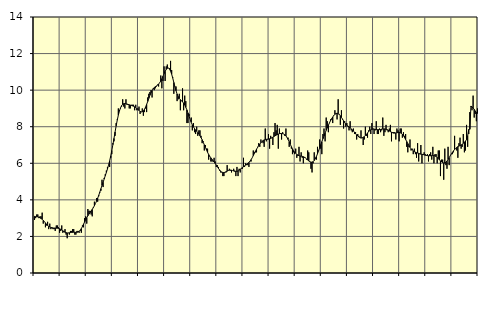
| Category | Piggar | Series 1 |
|---|---|---|
| nan | 2.9 | 3.1 |
| 87.0 | 3 | 3.08 |
| 87.0 | 3.2 | 3.08 |
| 87.0 | 3.2 | 3.07 |
| 87.0 | 3 | 3.05 |
| 87.0 | 3.1 | 3.02 |
| 87.0 | 3.1 | 2.98 |
| 87.0 | 3.3 | 2.94 |
| 87.0 | 2.7 | 2.88 |
| 87.0 | 2.8 | 2.81 |
| 87.0 | 2.5 | 2.74 |
| 87.0 | 2.6 | 2.67 |
| nan | 2.8 | 2.6 |
| 88.0 | 2.4 | 2.55 |
| 88.0 | 2.7 | 2.52 |
| 88.0 | 2.4 | 2.49 |
| 88.0 | 2.5 | 2.47 |
| 88.0 | 2.4 | 2.46 |
| 88.0 | 2.4 | 2.46 |
| 88.0 | 2.3 | 2.46 |
| 88.0 | 2.6 | 2.45 |
| 88.0 | 2.6 | 2.45 |
| 88.0 | 2.5 | 2.44 |
| 88.0 | 2.2 | 2.42 |
| nan | 2.3 | 2.39 |
| 89.0 | 2.6 | 2.35 |
| 89.0 | 2.2 | 2.31 |
| 89.0 | 2.3 | 2.26 |
| 89.0 | 2.4 | 2.23 |
| 89.0 | 2.1 | 2.21 |
| 89.0 | 1.9 | 2.19 |
| 89.0 | 2.2 | 2.19 |
| 89.0 | 2.1 | 2.2 |
| 89.0 | 2.3 | 2.21 |
| 89.0 | 2.3 | 2.22 |
| 89.0 | 2.4 | 2.22 |
| nan | 2.4 | 2.23 |
| 90.0 | 2.1 | 2.23 |
| 90.0 | 2.1 | 2.22 |
| 90.0 | 2.3 | 2.23 |
| 90.0 | 2.3 | 2.24 |
| 90.0 | 2.2 | 2.28 |
| 90.0 | 2.3 | 2.34 |
| 90.0 | 2.2 | 2.43 |
| 90.0 | 2.6 | 2.54 |
| 90.0 | 2.5 | 2.67 |
| 90.0 | 3 | 2.79 |
| 90.0 | 3.1 | 2.91 |
| nan | 2.7 | 3.03 |
| 91.0 | 3.5 | 3.13 |
| 91.0 | 3.4 | 3.22 |
| 91.0 | 3.4 | 3.31 |
| 91.0 | 3.2 | 3.39 |
| 91.0 | 3.1 | 3.48 |
| 91.0 | 3.6 | 3.57 |
| 91.0 | 3.9 | 3.68 |
| 91.0 | 3.8 | 3.8 |
| 91.0 | 4.1 | 3.94 |
| 91.0 | 3.9 | 4.09 |
| 91.0 | 4.2 | 4.25 |
| nan | 4.4 | 4.43 |
| 92.0 | 4.5 | 4.61 |
| 92.0 | 5.1 | 4.79 |
| 92.0 | 4.7 | 4.96 |
| 92.0 | 5.2 | 5.14 |
| 92.0 | 5.4 | 5.32 |
| 92.0 | 5.6 | 5.5 |
| 92.0 | 5.8 | 5.69 |
| 92.0 | 5.9 | 5.9 |
| 92.0 | 5.8 | 6.13 |
| 92.0 | 6.3 | 6.4 |
| 92.0 | 6.5 | 6.7 |
| nan | 7.1 | 7.02 |
| 93.0 | 7.2 | 7.36 |
| 93.0 | 7.5 | 7.71 |
| 93.0 | 8.2 | 8.05 |
| 93.0 | 8.4 | 8.36 |
| 93.0 | 9 | 8.63 |
| 93.0 | 8.9 | 8.86 |
| 93.0 | 9 | 9.03 |
| 93.0 | 9.1 | 9.15 |
| 93.0 | 9.5 | 9.23 |
| 93.0 | 9.1 | 9.26 |
| 93.0 | 9 | 9.27 |
| nan | 9.5 | 9.26 |
| 94.0 | 9.2 | 9.24 |
| 94.0 | 9.2 | 9.22 |
| 94.0 | 9 | 9.2 |
| 94.0 | 9 | 9.18 |
| 94.0 | 9.2 | 9.16 |
| 94.0 | 9.2 | 9.14 |
| 94.0 | 9.2 | 9.12 |
| 94.0 | 8.9 | 9.09 |
| 94.0 | 9.2 | 9.05 |
| 94.0 | 8.9 | 9 |
| 94.0 | 9 | 8.94 |
| nan | 9.1 | 8.89 |
| 95.0 | 8.7 | 8.84 |
| 95.0 | 8.8 | 8.81 |
| 95.0 | 9 | 8.82 |
| 95.0 | 8.6 | 8.86 |
| 95.0 | 8.8 | 8.95 |
| 95.0 | 9 | 9.07 |
| 95.0 | 8.8 | 9.22 |
| 95.0 | 9.6 | 9.38 |
| 95.0 | 9.8 | 9.55 |
| 95.0 | 9.9 | 9.72 |
| 95.0 | 10 | 9.86 |
| nan | 9.6 | 9.98 |
| 96.0 | 10.1 | 10.07 |
| 96.0 | 10 | 10.14 |
| 96.0 | 10.1 | 10.19 |
| 96.0 | 10.2 | 10.23 |
| 96.0 | 10.3 | 10.27 |
| 96.0 | 10.2 | 10.33 |
| 96.0 | 10.4 | 10.41 |
| 96.0 | 10.8 | 10.5 |
| 96.0 | 10.1 | 10.62 |
| 96.0 | 10.5 | 10.76 |
| 96.0 | 11.3 | 10.9 |
| nan | 10.5 | 11.03 |
| 97.0 | 11.3 | 11.13 |
| 97.0 | 11.4 | 11.2 |
| 97.0 | 11.2 | 11.21 |
| 97.0 | 11.2 | 11.16 |
| 97.0 | 11.6 | 11.04 |
| 97.0 | 11.1 | 10.87 |
| 97.0 | 10.7 | 10.66 |
| 97.0 | 9.8 | 10.42 |
| 97.0 | 10.2 | 10.18 |
| 97.0 | 10.2 | 9.97 |
| 97.0 | 9.4 | 9.79 |
| nan | 9.5 | 9.65 |
| 98.0 | 9.8 | 9.55 |
| 98.0 | 8.9 | 9.48 |
| 98.0 | 9.4 | 9.42 |
| 98.0 | 10.1 | 9.36 |
| 98.0 | 8.9 | 9.29 |
| 98.0 | 9.7 | 9.19 |
| 98.0 | 9.4 | 9.06 |
| 98.0 | 8.2 | 8.92 |
| 98.0 | 8.2 | 8.75 |
| 98.0 | 8.7 | 8.57 |
| 98.0 | 8.4 | 8.4 |
| nan | 8.5 | 8.24 |
| 99.0 | 7.8 | 8.1 |
| 99.0 | 8.2 | 7.99 |
| 99.0 | 7.7 | 7.9 |
| 99.0 | 7.6 | 7.82 |
| 99.0 | 8 | 7.75 |
| 99.0 | 7.5 | 7.68 |
| 99.0 | 7.8 | 7.6 |
| 99.0 | 7.8 | 7.5 |
| 99.0 | 7.5 | 7.4 |
| 99.0 | 7.1 | 7.29 |
| 99.0 | 7.2 | 7.15 |
| nan | 6.7 | 7.01 |
| 0.0 | 7 | 6.87 |
| 0.0 | 6.8 | 6.73 |
| 0.0 | 6.8 | 6.6 |
| 0.0 | 6.2 | 6.48 |
| 0.0 | 6.4 | 6.38 |
| 0.0 | 6.1 | 6.3 |
| 0.0 | 6.1 | 6.22 |
| 0.0 | 6.1 | 6.14 |
| 0.0 | 6.3 | 6.07 |
| 0.0 | 6.1 | 5.99 |
| 0.0 | 5.8 | 5.9 |
| nan | 5.9 | 5.81 |
| 1.0 | 5.8 | 5.72 |
| 1.0 | 5.6 | 5.64 |
| 1.0 | 5.5 | 5.57 |
| 1.0 | 5.5 | 5.52 |
| 1.0 | 5.3 | 5.5 |
| 1.0 | 5.3 | 5.49 |
| 1.0 | 5.5 | 5.51 |
| 1.0 | 5.5 | 5.54 |
| 1.0 | 5.9 | 5.57 |
| 1.0 | 5.6 | 5.6 |
| 1.0 | 5.7 | 5.62 |
| nan | 5.6 | 5.63 |
| 2.0 | 5.5 | 5.62 |
| 2.0 | 5.6 | 5.6 |
| 2.0 | 5.7 | 5.58 |
| 2.0 | 5.6 | 5.56 |
| 2.0 | 5.3 | 5.55 |
| 2.0 | 5.8 | 5.56 |
| 2.0 | 5.3 | 5.58 |
| 2.0 | 5.7 | 5.62 |
| 2.0 | 5.5 | 5.67 |
| 2.0 | 5.7 | 5.72 |
| 2.0 | 5.7 | 5.77 |
| nan | 6.3 | 5.81 |
| 3.0 | 5.8 | 5.86 |
| 3.0 | 6 | 5.9 |
| 3.0 | 5.9 | 5.94 |
| 3.0 | 5.9 | 5.99 |
| 3.0 | 5.8 | 6.05 |
| 3.0 | 6.1 | 6.12 |
| 3.0 | 6.1 | 6.2 |
| 3.0 | 6.3 | 6.3 |
| 3.0 | 6.7 | 6.42 |
| 3.0 | 6.6 | 6.54 |
| 3.0 | 6.6 | 6.66 |
| nan | 6.6 | 6.77 |
| 4.0 | 6.9 | 6.87 |
| 4.0 | 7.1 | 6.96 |
| 4.0 | 6.9 | 7.05 |
| 4.0 | 7.3 | 7.12 |
| 4.0 | 7.2 | 7.19 |
| 4.0 | 7.1 | 7.24 |
| 4.0 | 6.9 | 7.28 |
| 4.0 | 7.9 | 7.3 |
| 4.0 | 7.2 | 7.31 |
| 4.0 | 7.3 | 7.32 |
| 4.0 | 7.6 | 7.32 |
| nan | 6.8 | 7.34 |
| 5.0 | 7.5 | 7.36 |
| 5.0 | 7.4 | 7.39 |
| 5.0 | 7 | 7.43 |
| 5.0 | 7.7 | 7.47 |
| 5.0 | 8.2 | 7.5 |
| 5.0 | 7.8 | 7.54 |
| 5.0 | 8.1 | 7.57 |
| 5.0 | 6.8 | 7.6 |
| 5.0 | 7.9 | 7.62 |
| 5.0 | 7.6 | 7.63 |
| 5.0 | 7.3 | 7.63 |
| nan | 7.7 | 7.62 |
| 6.0 | 7.6 | 7.6 |
| 6.0 | 7.5 | 7.56 |
| 6.0 | 7.9 | 7.5 |
| 6.0 | 7.4 | 7.41 |
| 6.0 | 7.4 | 7.3 |
| 6.0 | 6.9 | 7.18 |
| 6.0 | 7.3 | 7.04 |
| 6.0 | 6.8 | 6.91 |
| 6.0 | 6.5 | 6.79 |
| 6.0 | 6.6 | 6.69 |
| 6.0 | 6.5 | 6.61 |
| nan | 6.8 | 6.55 |
| 7.0 | 6.3 | 6.49 |
| 7.0 | 6.4 | 6.45 |
| 7.0 | 6.9 | 6.42 |
| 7.0 | 6.1 | 6.4 |
| 7.0 | 6.6 | 6.39 |
| 7.0 | 6.3 | 6.38 |
| 7.0 | 6 | 6.36 |
| 7.0 | 6.3 | 6.33 |
| 7.0 | 6.3 | 6.29 |
| 7.0 | 6.2 | 6.24 |
| 7.0 | 6.7 | 6.18 |
| nan | 6.6 | 6.12 |
| 8.0 | 6.1 | 6.08 |
| 8.0 | 5.7 | 6.06 |
| 8.0 | 5.5 | 6.06 |
| 8.0 | 6 | 6.09 |
| 8.0 | 6.6 | 6.15 |
| 8.0 | 6.3 | 6.25 |
| 8.0 | 6.2 | 6.37 |
| 8.0 | 6.9 | 6.52 |
| 8.0 | 6.7 | 6.68 |
| 8.0 | 7.3 | 6.85 |
| 8.0 | 6.8 | 7.02 |
| nan | 6.5 | 7.18 |
| 9.0 | 7.6 | 7.34 |
| 9.0 | 7.9 | 7.49 |
| 9.0 | 7.2 | 7.65 |
| 9.0 | 8.5 | 7.8 |
| 9.0 | 8.3 | 7.94 |
| 9.0 | 7.7 | 8.08 |
| 9.0 | 8.2 | 8.21 |
| 9.0 | 8.4 | 8.33 |
| 9.0 | 8.4 | 8.44 |
| 9.0 | 8.2 | 8.53 |
| 9.0 | 8.6 | 8.62 |
| nan | 8.9 | 8.68 |
| 10.0 | 8.7 | 8.72 |
| 10.0 | 8.4 | 8.74 |
| 10.0 | 9.5 | 8.72 |
| 10.0 | 8.7 | 8.67 |
| 10.0 | 8.1 | 8.6 |
| 10.0 | 8.9 | 8.51 |
| 10.0 | 8.4 | 8.42 |
| 10.0 | 7.9 | 8.32 |
| 10.0 | 8.3 | 8.23 |
| 10.0 | 8 | 8.15 |
| 10.0 | 8.2 | 8.09 |
| nan | 8 | 8.04 |
| 11.0 | 7.8 | 7.99 |
| 11.0 | 8.3 | 7.94 |
| 11.0 | 7.8 | 7.89 |
| 11.0 | 7.7 | 7.83 |
| 11.0 | 7.9 | 7.77 |
| 11.0 | 7.6 | 7.69 |
| 11.0 | 7.7 | 7.62 |
| 11.0 | 7.3 | 7.55 |
| 11.0 | 7.6 | 7.49 |
| 11.0 | 7.5 | 7.44 |
| 11.0 | 7.4 | 7.4 |
| nan | 7.8 | 7.38 |
| 12.0 | 7.4 | 7.39 |
| 12.0 | 7 | 7.42 |
| 12.0 | 7.3 | 7.46 |
| 12.0 | 8 | 7.52 |
| 12.0 | 7.5 | 7.58 |
| 12.0 | 7.4 | 7.66 |
| 12.0 | 7.8 | 7.73 |
| 12.0 | 8 | 7.79 |
| 12.0 | 7.6 | 7.83 |
| 12.0 | 8.2 | 7.86 |
| 12.0 | 7.9 | 7.87 |
| nan | 7.6 | 7.87 |
| 13.0 | 7.8 | 7.86 |
| 13.0 | 8.3 | 7.85 |
| 13.0 | 7.6 | 7.84 |
| 13.0 | 7.6 | 7.84 |
| 13.0 | 7.9 | 7.84 |
| 13.0 | 7.7 | 7.85 |
| 13.0 | 7.8 | 7.87 |
| 13.0 | 8.5 | 7.88 |
| 13.0 | 7.5 | 7.88 |
| 13.0 | 7.7 | 7.88 |
| 13.0 | 8.1 | 7.86 |
| nan | 7.8 | 7.84 |
| 14.0 | 7.7 | 7.81 |
| 14.0 | 7.9 | 7.77 |
| 14.0 | 8.1 | 7.73 |
| 14.0 | 7.2 | 7.7 |
| 14.0 | 7.7 | 7.67 |
| 14.0 | 7.7 | 7.65 |
| 14.0 | 7.7 | 7.65 |
| 14.0 | 7.3 | 7.65 |
| 14.0 | 7.9 | 7.67 |
| 14.0 | 7.8 | 7.68 |
| 14.0 | 7.2 | 7.69 |
| nan | 7.9 | 7.67 |
| 15.0 | 7.9 | 7.64 |
| 15.0 | 7.4 | 7.59 |
| 15.0 | 7.7 | 7.51 |
| 15.0 | 7.5 | 7.41 |
| 15.0 | 7.6 | 7.3 |
| 15.0 | 6.9 | 7.19 |
| 15.0 | 6.6 | 7.08 |
| 15.0 | 6.9 | 6.97 |
| 15.0 | 7.3 | 6.87 |
| 15.0 | 6.7 | 6.79 |
| 15.0 | 6.8 | 6.73 |
| nan | 6.5 | 6.68 |
| 16.0 | 6.8 | 6.64 |
| 16.0 | 6.5 | 6.61 |
| 16.0 | 6.3 | 6.58 |
| 16.0 | 7.1 | 6.56 |
| 16.0 | 6.1 | 6.54 |
| 16.0 | 6.5 | 6.52 |
| 16.0 | 7 | 6.5 |
| 16.0 | 6 | 6.49 |
| 16.0 | 6.5 | 6.48 |
| 16.0 | 6.6 | 6.46 |
| 16.0 | 6.5 | 6.44 |
| nan | 6.4 | 6.43 |
| 17.0 | 6.5 | 6.42 |
| 17.0 | 6.1 | 6.41 |
| 17.0 | 6.5 | 6.41 |
| 17.0 | 6.6 | 6.41 |
| 17.0 | 6.2 | 6.42 |
| 17.0 | 6.9 | 6.43 |
| 17.0 | 6 | 6.42 |
| 17.0 | 6.5 | 6.4 |
| 17.0 | 6.5 | 6.37 |
| 17.0 | 6 | 6.32 |
| 17.0 | 6.7 | 6.26 |
| nan | 6.7 | 6.19 |
| 18.0 | 5.3 | 6.13 |
| 18.0 | 6.2 | 6.07 |
| 18.0 | 6.2 | 6.04 |
| 18.0 | 5.1 | 6.02 |
| 18.0 | 6.8 | 6.02 |
| 18.0 | 5.9 | 6.06 |
| 18.0 | 5.7 | 6.12 |
| 18.0 | 6.9 | 6.21 |
| 18.0 | 5.9 | 6.31 |
| 18.0 | 6.4 | 6.41 |
| 18.0 | 6.5 | 6.51 |
| nan | 6.5 | 6.6 |
| 19.0 | 6.6 | 6.68 |
| 19.0 | 7.5 | 6.75 |
| 19.0 | 6.8 | 6.81 |
| 19.0 | 6.7 | 6.87 |
| 19.0 | 6.3 | 6.91 |
| 19.0 | 7.1 | 6.94 |
| 19.0 | 7.4 | 6.97 |
| 19.0 | 6.8 | 7 |
| 19.0 | 6.9 | 7.04 |
| 19.0 | 7.6 | 7.09 |
| 19.0 | 6.6 | 7.15 |
| nan | 6.7 | 7.22 |
| 20.0 | 8.1 | 7.29 |
| 20.0 | 6.9 | 7.51 |
| 20.0 | 7.6 | 7.85 |
| 20.0 | 8.8 | 7.86 |
| 20.0 | 9.1 | 9.13 |
| 20.0 | 8.9 | 9.09 |
| 20.0 | 9.7 | 9.03 |
| 20.0 | 8.5 | 8.95 |
| 20.0 | 8.7 | 8.86 |
| 20.0 | 8.3 | 8.78 |
| 20.0 | 9 | 8.72 |